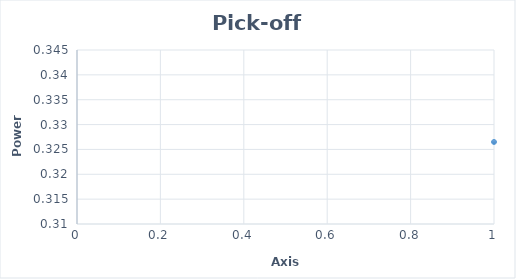
| Category | Series 0 |
|---|---|
| 0 | 0.326 |
| 1 | 0.34 |
| 2 | 0.329 |
| 3 | 0.33 |
| 4 | 0.331 |
| 5 | 0.333 |
| 6 | 0.336 |
| 7 | 0.334 |
| 8 | 0.335 |
| 9 | 0.335 |
| 10 | 0.336 |
| 11 | 0.336 |
| 12 | 0.336 |
| 13 | 0.337 |
| 14 | 0.336 |
| 15 | 0.336 |
| 16 | 0.332 |
| 17 | 0.323 |
| 18 | 0.322 |
| 19 | 0.322 |
| 20 | 0.322 |
| 21 | 0.321 |
| 22 | 0.316 |
| 23 | 0.316 |
| 24 | 0.319 |
| 25 | 0.321 |
| 26 | 0.314 |
| 27 | 0.318 |
| 28 | 0.319 |
| 29 | 0.314 |
| 30 | 0.312 |
| 31 | 0.316 |
| 32 | 0.313 |
| 33 | 0.312 |